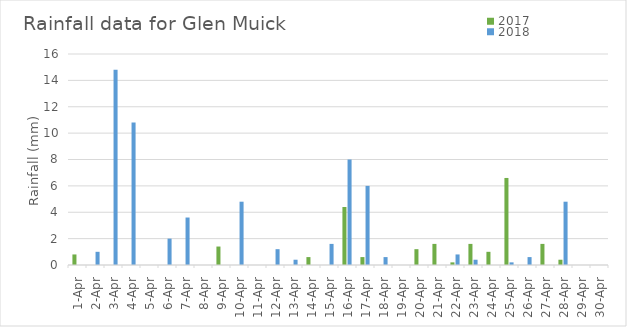
| Category | 2017 | 2018 |
|---|---|---|
| 2017-04-01 | 0.8 | 0 |
| 2017-04-02 | 0 | 1 |
| 2017-04-03 | 0 | 14.8 |
| 2017-04-04 | 0 | 10.8 |
| 2017-04-05 | 0 | 0 |
| 2017-04-06 | 0 | 2 |
| 2017-04-07 | 0 | 3.6 |
| 2017-04-08 | 0 | 0 |
| 2017-04-09 | 1.4 | 0 |
| 2017-04-10 | 0 | 4.8 |
| 2017-04-11 | 0 | 0 |
| 2017-04-12 | 0 | 1.2 |
| 2017-04-13 | 0 | 0.4 |
| 2017-04-14 | 0.6 | 0 |
| 2017-04-15 | 0 | 1.6 |
| 2017-04-16 | 4.4 | 8 |
| 2017-04-17 | 0.6 | 6 |
| 2017-04-18 | 0 | 0.6 |
| 2017-04-19 | 0 | 0 |
| 2017-04-20 | 1.2 | 0 |
| 2017-04-21 | 1.6 | 0 |
| 2017-04-22 | 0.2 | 0.8 |
| 2017-04-23 | 1.6 | 0.4 |
| 2017-04-24 | 1 | 0 |
| 2017-04-25 | 6.6 | 0.2 |
| 2017-04-26 | 0 | 0.6 |
| 2017-04-27 | 1.6 | 0 |
| 2017-04-28 | 0.4 | 4.8 |
| 2017-04-29 | 0 | 0 |
| 2017-04-30 | 0 | 0 |